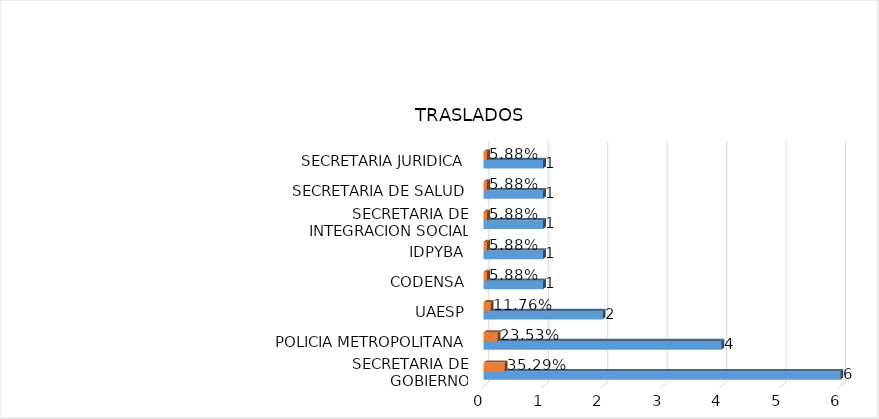
| Category | Cuenta de Número petición | Cuenta de Número petición2 |
|---|---|---|
| SECRETARIA DE GOBIERNO | 6 | 0.353 |
| POLICIA METROPOLITANA | 4 | 0.235 |
| UAESP | 2 | 0.118 |
| CODENSA | 1 | 0.059 |
| IDPYBA | 1 | 0.059 |
| SECRETARIA DE INTEGRACION SOCIAL | 1 | 0.059 |
| SECRETARIA DE SALUD | 1 | 0.059 |
| SECRETARIA JURIDICA | 1 | 0.059 |